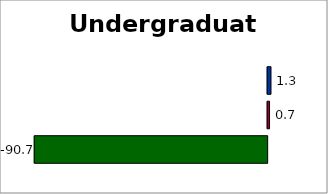
| Category | State | SREB states | 50 states and D.C. |
|---|---|---|---|
| 0 | -90.746 | 0.729 | 1.297 |